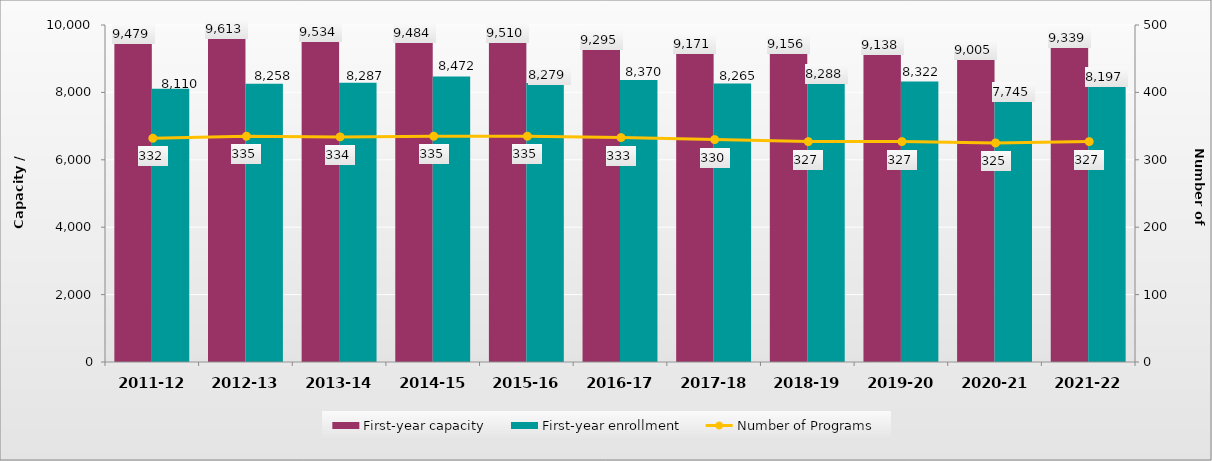
| Category | First-year capacity | First-year enrollment |
|---|---|---|
| 2011-12 | 9479 | 8110 |
| 2012-13 | 9613 | 8258 |
| 2013-14 | 9534 | 8287 |
| 2014-15 | 9484 | 8472 |
| 2015-16 | 9510 | 8279 |
| 2016-17 | 9295 | 8370 |
| 2017-18 | 9171 | 8265 |
| 2018-19 | 9156 | 8288 |
| 2019-20 | 9138 | 8322 |
| 2020-21 | 9005 | 7745 |
| 2021-22 | 9339 | 8197 |